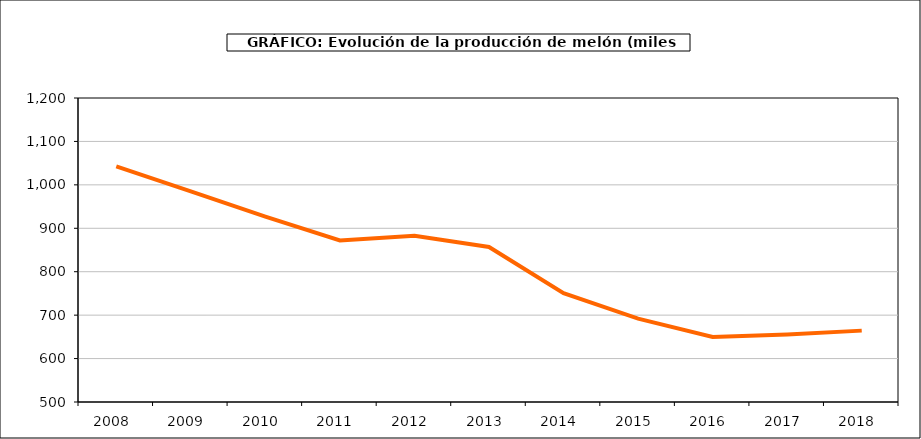
| Category | producción |
|---|---|
| 2008.0 | 1042.439 |
| 2009.0 | 984.786 |
| 2010.0 | 926.693 |
| 2011.0 | 871.996 |
| 2012.0 | 882.869 |
| 2013.0 | 856.951 |
| 2014.0 | 750.592 |
| 2015.0 | 692.056 |
| 2016.0 | 649.767 |
| 2017.0 | 655.677 |
| 2018.0 | 664.353 |